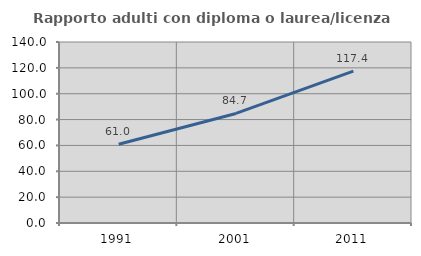
| Category | Rapporto adulti con diploma o laurea/licenza media  |
|---|---|
| 1991.0 | 60.954 |
| 2001.0 | 84.748 |
| 2011.0 | 117.417 |